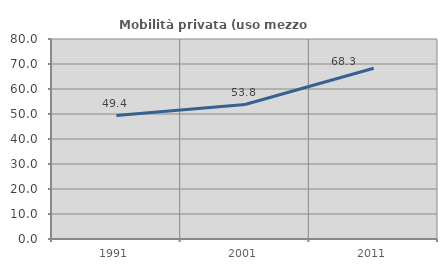
| Category | Mobilità privata (uso mezzo privato) |
|---|---|
| 1991.0 | 49.39 |
| 2001.0 | 53.786 |
| 2011.0 | 68.306 |